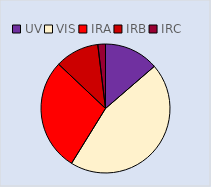
| Category | Series 0 |
|---|---|
| UV | 200898.165 |
| VIS | 663154.499 |
| IRA | 414691.049 |
| IRB | 162108.418 |
| IRC | 28192.606 |